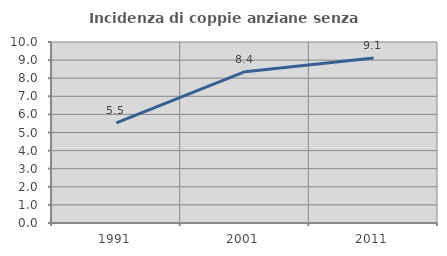
| Category | Incidenza di coppie anziane senza figli  |
|---|---|
| 1991.0 | 5.528 |
| 2001.0 | 8.36 |
| 2011.0 | 9.113 |